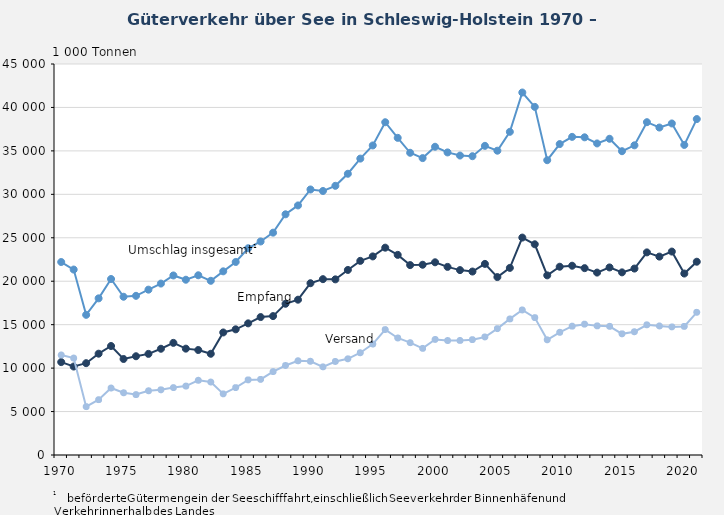
| Category | Umschlag insgesamt1 | Empfang | Versand |
|---|---|---|---|
| 1970.0 | 22209 | 10692 | 11517 |
| 1971.0 | 21343 | 10182 | 11161 |
| 1972.0 | 16132 | 10568 | 5564 |
| 1973.0 | 18029 | 11659 | 6370 |
| 1974.0 | 20254 | 12543 | 7711 |
| 1975.0 | 18212 | 11049 | 7163 |
| 1976.0 | 18320 | 11365 | 6955 |
| 1977.0 | 19029 | 11637 | 7392 |
| 1978.0 | 19731 | 12229 | 7502 |
| 1979.0 | 20663 | 12904 | 7759 |
| 1980.0 | 20173 | 12240 | 7933 |
| 1981.0 | 20685 | 12083 | 8602 |
| 1982.0 | 20049 | 11651 | 8398 |
| 1983.0 | 21138 | 14103 | 7035 |
| 1984.0 | 22216 | 14463 | 7753 |
| 1985.0 | 23795 | 15150 | 8645 |
| 1986.0 | 24575 | 15876 | 8699 |
| 1987.0 | 25589 | 15985 | 9604 |
| 1988.0 | 27703 | 17405 | 10298 |
| 1989.0 | 28722 | 17875 | 10847 |
| 1990.0 | 30558 | 19771 | 10787 |
| 1991.0 | 30385 | 20237 | 10148 |
| 1992.0 | 30980 | 20215 | 10765 |
| 1993.0 | 32368 | 21298 | 11070 |
| 1994.0 | 34111 | 22342 | 11769 |
| 1995.0 | 35626 | 22856 | 12770 |
| 1996.0 | 38297 | 23862 | 14435 |
| 1997.0 | 36501 | 23033 | 13468 |
| 1998.0 | 34783 | 21855 | 12929 |
| 1999.0 | 34170 | 21895 | 12275 |
| 2000.0 | 35476 | 22178 | 13298 |
| 2001.0 | 34823 | 21649 | 13174 |
| 2002.0 | 34465 | 21278 | 13187 |
| 2003.0 | 34390 | 21114 | 13277 |
| 2004.0 | 35581 | 21995 | 13585 |
| 2005.0 | 35021 | 20478 | 14543 |
| 2006.0 | 37196 | 21535 | 15661 |
| 2007.0 | 41718 | 25022 | 16695 |
| 2008.0 | 40064 | 24252 | 15812 |
| 2009.0 | 33928 | 20674 | 13254 |
| 2010.0 | 35786 | 21667 | 14120 |
| 2011.0 | 36614 | 21784 | 14830 |
| 2012.0 | 36563 | 21505 | 15059 |
| 2013.0 | 35856 | 20994 | 14862 |
| 2014.0 | 36393 | 21586 | 14807 |
| 2015.0 | 34963 | 21019 | 13944 |
| 2016.0 | 35642 | 21457 | 14185 |
| 2017.0 | 38302 | 23318 | 14984 |
| 2018.0 | 37688 | 22834 | 14854 |
| 2019.0 | 38156 | 23413 | 14743 |
| 2020.0 | 35685 | 20884 | 14801 |
| 2021.0 | 38663 | 22243 | 16420 |